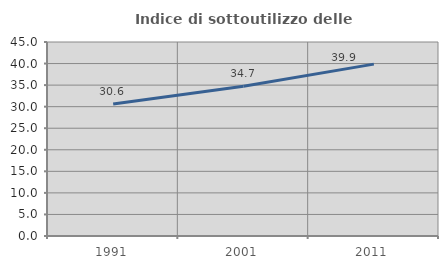
| Category | Indice di sottoutilizzo delle abitazioni  |
|---|---|
| 1991.0 | 30.619 |
| 2001.0 | 34.732 |
| 2011.0 | 39.866 |